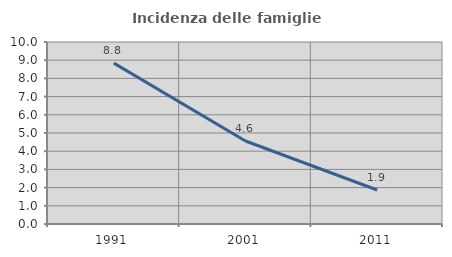
| Category | Incidenza delle famiglie numerose |
|---|---|
| 1991.0 | 8.838 |
| 2001.0 | 4.561 |
| 2011.0 | 1.87 |